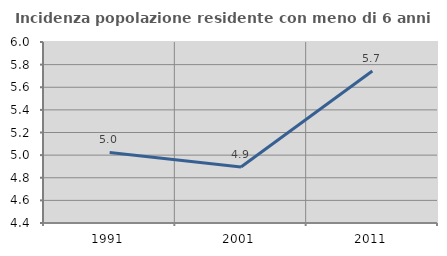
| Category | Incidenza popolazione residente con meno di 6 anni |
|---|---|
| 1991.0 | 5.024 |
| 2001.0 | 4.894 |
| 2011.0 | 5.744 |